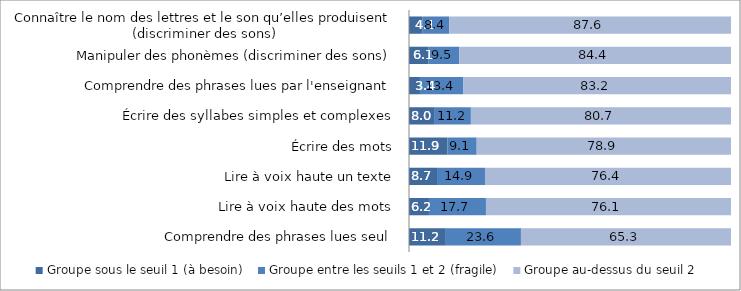
| Category | Groupe sous le seuil 1 (à besoin) | Groupe entre les seuils 1 et 2 (fragile) | Groupe au-dessus du seuil 2 |
|---|---|---|---|
| Comprendre des phrases lues seul | 11.2 | 23.6 | 65.3 |
| Lire à voix haute des mots | 6.2 | 17.7 | 76.1 |
| Lire à voix haute un texte | 8.7 | 14.9 | 76.4 |
| Écrire des mots | 11.9 | 9.1 | 78.9 |
| Écrire des syllabes simples et complexes | 8 | 11.2 | 80.7 |
| Comprendre des phrases lues par l'enseignant | 3.4 | 13.4 | 83.2 |
| Manipuler des phonèmes (discriminer des sons) | 6.1 | 9.5 | 84.4 |
| Connaître le nom des lettres et le son qu’elles produisent (discriminer des sons) | 4.1 | 8.4 | 87.6 |